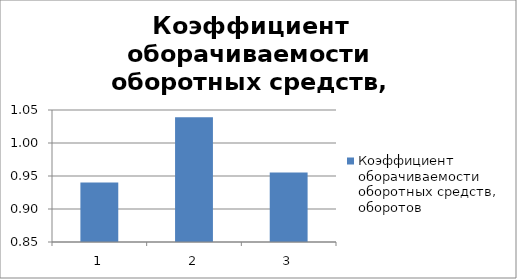
| Category | Коэффициент оборачиваемости оборотных средств, оборотов |
|---|---|
| 0 | 0.94 |
| 1 | 1.039 |
| 2 | 0.955 |